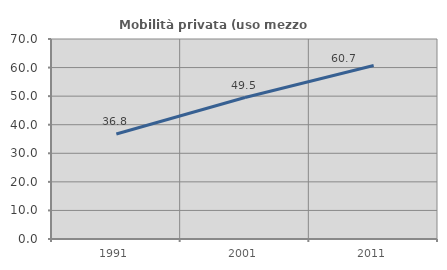
| Category | Mobilità privata (uso mezzo privato) |
|---|---|
| 1991.0 | 36.772 |
| 2001.0 | 49.515 |
| 2011.0 | 60.714 |